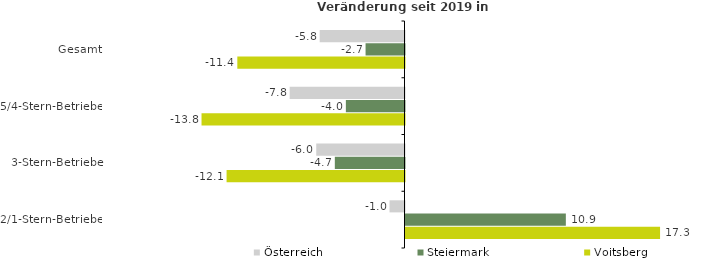
| Category | Österreich | Steiermark | Voitsberg |
|---|---|---|---|
| Gesamt | -5.779 | -2.653 | -11.392 |
| 5/4-Stern-Betriebe | -7.825 | -3.996 | -13.831 |
| 3-Stern-Betriebe | -6.014 | -4.748 | -12.124 |
| 2/1-Stern-Betriebe | -1.021 | 10.926 | 17.346 |